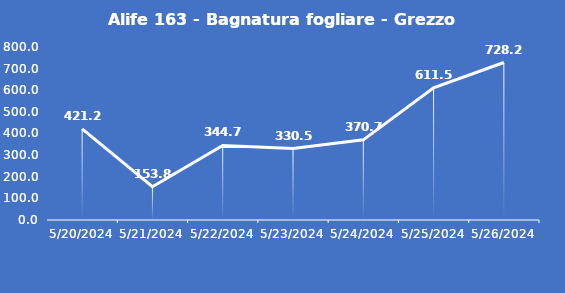
| Category | Alife 163 - Bagnatura fogliare - Grezzo (min) |
|---|---|
| 5/20/24 | 421.2 |
| 5/21/24 | 153.8 |
| 5/22/24 | 344.7 |
| 5/23/24 | 330.5 |
| 5/24/24 | 370.7 |
| 5/25/24 | 611.5 |
| 5/26/24 | 728.2 |